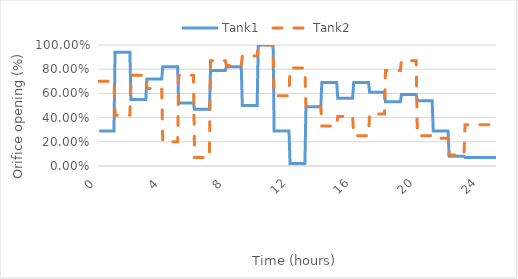
| Category | Tank1  | Tank2  |
|---|---|---|
| 0.0 | 0.29 | 0.7 |
| 0.016666666666666666 | 0.29 | 0.7 |
| 0.03333333333333333 | 0.29 | 0.7 |
| 0.05 | 0.29 | 0.7 |
| 0.06666666666666667 | 0.29 | 0.7 |
| 0.08333333333333333 | 0.29 | 0.7 |
| 0.09999999999999999 | 0.29 | 0.7 |
| 0.11666666666666665 | 0.29 | 0.7 |
| 0.13333333333333333 | 0.29 | 0.7 |
| 0.15 | 0.29 | 0.7 |
| 0.16666666666666666 | 0.29 | 0.7 |
| 0.18333333333333332 | 0.29 | 0.7 |
| 0.19999999999999998 | 0.29 | 0.7 |
| 0.21666666666666665 | 0.29 | 0.7 |
| 0.2333333333333333 | 0.29 | 0.7 |
| 0.24999999999999997 | 0.29 | 0.7 |
| 0.26666666666666666 | 0.29 | 0.7 |
| 0.2833333333333333 | 0.29 | 0.7 |
| 0.3 | 0.29 | 0.7 |
| 0.31666666666666665 | 0.29 | 0.7 |
| 0.3333333333333333 | 0.29 | 0.7 |
| 0.35 | 0.29 | 0.7 |
| 0.36666666666666664 | 0.29 | 0.7 |
| 0.3833333333333333 | 0.29 | 0.7 |
| 0.39999999999999997 | 0.29 | 0.7 |
| 0.41666666666666663 | 0.29 | 0.7 |
| 0.4333333333333333 | 0.29 | 0.7 |
| 0.44999999999999996 | 0.29 | 0.7 |
| 0.4666666666666666 | 0.29 | 0.7 |
| 0.4833333333333333 | 0.29 | 0.7 |
| 0.49999999999999994 | 0.29 | 0.7 |
| 0.5166666666666666 | 0.29 | 0.7 |
| 0.5333333333333333 | 0.29 | 0.7 |
| 0.55 | 0.29 | 0.7 |
| 0.5666666666666668 | 0.29 | 0.7 |
| 0.5833333333333335 | 0.29 | 0.7 |
| 0.6000000000000002 | 0.29 | 0.7 |
| 0.6166666666666669 | 0.29 | 0.7 |
| 0.6333333333333336 | 0.29 | 0.7 |
| 0.6500000000000004 | 0.29 | 0.7 |
| 0.6666666666666671 | 0.29 | 0.7 |
| 0.6833333333333338 | 0.29 | 0.7 |
| 0.7000000000000005 | 0.29 | 0.7 |
| 0.7166666666666672 | 0.29 | 0.7 |
| 0.733333333333334 | 0.29 | 0.7 |
| 0.7500000000000007 | 0.29 | 0.7 |
| 0.7666666666666674 | 0.29 | 0.7 |
| 0.7833333333333341 | 0.29 | 0.7 |
| 0.8000000000000008 | 0.29 | 0.7 |
| 0.8166666666666675 | 0.29 | 0.7 |
| 0.8333333333333343 | 0.29 | 0.7 |
| 0.850000000000001 | 0.29 | 0.7 |
| 0.8666666666666677 | 0.29 | 0.7 |
| 0.8833333333333344 | 0.29 | 0.7 |
| 0.9000000000000011 | 0.29 | 0.7 |
| 0.9166666666666679 | 0.29 | 0.7 |
| 0.9333333333333346 | 0.29 | 0.7 |
| 0.9500000000000013 | 0.29 | 0.7 |
| 0.966666666666668 | 0.29 | 0.7 |
| 0.9833333333333347 | 0.29 | 0.7 |
| 1.0000000000000013 | 0.94 | 0.42 |
| 1.016666666666668 | 0.94 | 0.42 |
| 1.0333333333333345 | 0.94 | 0.42 |
| 1.0500000000000012 | 0.94 | 0.42 |
| 1.0666666666666678 | 0.94 | 0.42 |
| 1.0833333333333344 | 0.94 | 0.42 |
| 1.100000000000001 | 0.94 | 0.42 |
| 1.1166666666666676 | 0.94 | 0.42 |
| 1.1333333333333342 | 0.94 | 0.42 |
| 1.1500000000000008 | 0.94 | 0.42 |
| 1.1666666666666674 | 0.94 | 0.42 |
| 1.183333333333334 | 0.94 | 0.42 |
| 1.2000000000000006 | 0.94 | 0.42 |
| 1.2166666666666672 | 0.94 | 0.42 |
| 1.2333333333333338 | 0.94 | 0.42 |
| 1.2500000000000004 | 0.94 | 0.42 |
| 1.266666666666667 | 0.94 | 0.42 |
| 1.2833333333333337 | 0.94 | 0.42 |
| 1.3000000000000003 | 0.94 | 0.42 |
| 1.3166666666666669 | 0.94 | 0.42 |
| 1.3333333333333335 | 0.94 | 0.42 |
| 1.35 | 0.94 | 0.42 |
| 1.3666666666666667 | 0.94 | 0.42 |
| 1.3833333333333333 | 0.94 | 0.42 |
| 1.4 | 0.94 | 0.42 |
| 1.4166666666666665 | 0.94 | 0.42 |
| 1.4333333333333331 | 0.94 | 0.42 |
| 1.4499999999999997 | 0.94 | 0.42 |
| 1.4666666666666663 | 0.94 | 0.42 |
| 1.483333333333333 | 0.94 | 0.42 |
| 1.4999999999999996 | 0.94 | 0.42 |
| 1.5166666666666662 | 0.94 | 0.42 |
| 1.5333333333333328 | 0.94 | 0.42 |
| 1.5499999999999994 | 0.94 | 0.42 |
| 1.566666666666666 | 0.94 | 0.42 |
| 1.5833333333333326 | 0.94 | 0.42 |
| 1.5999999999999992 | 0.94 | 0.42 |
| 1.6166666666666658 | 0.94 | 0.42 |
| 1.6333333333333324 | 0.94 | 0.42 |
| 1.649999999999999 | 0.94 | 0.42 |
| 1.6666666666666656 | 0.94 | 0.42 |
| 1.6833333333333322 | 0.94 | 0.42 |
| 1.6999999999999988 | 0.94 | 0.42 |
| 1.7166666666666655 | 0.94 | 0.42 |
| 1.733333333333332 | 0.94 | 0.42 |
| 1.7499999999999987 | 0.94 | 0.42 |
| 1.7666666666666653 | 0.94 | 0.42 |
| 1.7833333333333319 | 0.94 | 0.42 |
| 1.7999999999999985 | 0.94 | 0.42 |
| 1.816666666666665 | 0.94 | 0.42 |
| 1.8333333333333317 | 0.94 | 0.42 |
| 1.8499999999999983 | 0.94 | 0.42 |
| 1.866666666666665 | 0.94 | 0.42 |
| 1.8833333333333315 | 0.94 | 0.42 |
| 1.8999999999999981 | 0.94 | 0.42 |
| 1.9166666666666647 | 0.94 | 0.42 |
| 1.9333333333333313 | 0.94 | 0.42 |
| 1.949999999999998 | 0.94 | 0.42 |
| 1.9666666666666646 | 0.94 | 0.42 |
| 1.9833333333333312 | 0.94 | 0.42 |
| 1.9999999999999978 | 0.55 | 0.75 |
| 2.0166666666666644 | 0.55 | 0.75 |
| 2.033333333333331 | 0.55 | 0.75 |
| 2.0499999999999976 | 0.55 | 0.75 |
| 2.066666666666664 | 0.55 | 0.75 |
| 2.083333333333331 | 0.55 | 0.75 |
| 2.0999999999999974 | 0.55 | 0.75 |
| 2.116666666666664 | 0.55 | 0.75 |
| 2.1333333333333306 | 0.55 | 0.75 |
| 2.1499999999999972 | 0.55 | 0.75 |
| 2.166666666666664 | 0.55 | 0.75 |
| 2.1833333333333305 | 0.55 | 0.75 |
| 2.199999999999997 | 0.55 | 0.75 |
| 2.2166666666666637 | 0.55 | 0.75 |
| 2.2333333333333303 | 0.55 | 0.75 |
| 2.249999999999997 | 0.55 | 0.75 |
| 2.2666666666666635 | 0.55 | 0.75 |
| 2.28333333333333 | 0.55 | 0.75 |
| 2.2999999999999967 | 0.55 | 0.75 |
| 2.3166666666666633 | 0.55 | 0.75 |
| 2.33333333333333 | 0.55 | 0.75 |
| 2.3499999999999965 | 0.55 | 0.75 |
| 2.366666666666663 | 0.55 | 0.75 |
| 2.3833333333333298 | 0.55 | 0.75 |
| 2.3999999999999964 | 0.55 | 0.75 |
| 2.416666666666663 | 0.55 | 0.75 |
| 2.4333333333333296 | 0.55 | 0.75 |
| 2.449999999999996 | 0.55 | 0.75 |
| 2.466666666666663 | 0.55 | 0.75 |
| 2.4833333333333294 | 0.55 | 0.75 |
| 2.499999999999996 | 0.55 | 0.75 |
| 2.5166666666666626 | 0.55 | 0.75 |
| 2.533333333333329 | 0.55 | 0.75 |
| 2.549999999999996 | 0.55 | 0.75 |
| 2.5666666666666624 | 0.55 | 0.75 |
| 2.583333333333329 | 0.55 | 0.75 |
| 2.5999999999999956 | 0.55 | 0.75 |
| 2.6166666666666623 | 0.55 | 0.75 |
| 2.633333333333329 | 0.55 | 0.75 |
| 2.6499999999999955 | 0.55 | 0.75 |
| 2.666666666666662 | 0.55 | 0.75 |
| 2.6833333333333287 | 0.55 | 0.75 |
| 2.6999999999999953 | 0.55 | 0.75 |
| 2.716666666666662 | 0.55 | 0.75 |
| 2.7333333333333285 | 0.55 | 0.75 |
| 2.749999999999995 | 0.55 | 0.75 |
| 2.7666666666666617 | 0.55 | 0.75 |
| 2.7833333333333283 | 0.55 | 0.75 |
| 2.799999999999995 | 0.55 | 0.75 |
| 2.8166666666666615 | 0.55 | 0.75 |
| 2.833333333333328 | 0.55 | 0.75 |
| 2.8499999999999948 | 0.55 | 0.75 |
| 2.8666666666666614 | 0.55 | 0.75 |
| 2.883333333333328 | 0.55 | 0.75 |
| 2.8999999999999946 | 0.55 | 0.75 |
| 2.916666666666661 | 0.55 | 0.75 |
| 2.933333333333328 | 0.55 | 0.75 |
| 2.9499999999999944 | 0.55 | 0.75 |
| 2.966666666666661 | 0.55 | 0.75 |
| 2.9833333333333276 | 0.55 | 0.75 |
| 2.9999999999999942 | 0.72 | 0.64 |
| 3.016666666666661 | 0.72 | 0.64 |
| 3.0333333333333274 | 0.72 | 0.64 |
| 3.049999999999994 | 0.72 | 0.64 |
| 3.0666666666666607 | 0.72 | 0.64 |
| 3.0833333333333273 | 0.72 | 0.64 |
| 3.099999999999994 | 0.72 | 0.64 |
| 3.1166666666666605 | 0.72 | 0.64 |
| 3.133333333333327 | 0.72 | 0.64 |
| 3.1499999999999937 | 0.72 | 0.64 |
| 3.1666666666666603 | 0.72 | 0.64 |
| 3.183333333333327 | 0.72 | 0.64 |
| 3.1999999999999935 | 0.72 | 0.64 |
| 3.21666666666666 | 0.72 | 0.64 |
| 3.2333333333333267 | 0.72 | 0.64 |
| 3.2499999999999933 | 0.72 | 0.64 |
| 3.26666666666666 | 0.72 | 0.64 |
| 3.2833333333333266 | 0.72 | 0.64 |
| 3.299999999999993 | 0.72 | 0.64 |
| 3.3166666666666598 | 0.72 | 0.64 |
| 3.3333333333333264 | 0.72 | 0.64 |
| 3.349999999999993 | 0.72 | 0.64 |
| 3.3666666666666596 | 0.72 | 0.64 |
| 3.383333333333326 | 0.72 | 0.64 |
| 3.399999999999993 | 0.72 | 0.64 |
| 3.4166666666666594 | 0.72 | 0.64 |
| 3.433333333333326 | 0.72 | 0.64 |
| 3.4499999999999926 | 0.72 | 0.64 |
| 3.4666666666666592 | 0.72 | 0.64 |
| 3.483333333333326 | 0.72 | 0.64 |
| 3.4999999999999925 | 0.72 | 0.64 |
| 3.516666666666659 | 0.72 | 0.64 |
| 3.5333333333333257 | 0.72 | 0.64 |
| 3.5499999999999923 | 0.72 | 0.64 |
| 3.566666666666659 | 0.72 | 0.64 |
| 3.5833333333333255 | 0.72 | 0.64 |
| 3.599999999999992 | 0.72 | 0.64 |
| 3.6166666666666587 | 0.72 | 0.64 |
| 3.6333333333333253 | 0.72 | 0.64 |
| 3.649999999999992 | 0.72 | 0.64 |
| 3.6666666666666585 | 0.72 | 0.64 |
| 3.683333333333325 | 0.72 | 0.64 |
| 3.6999999999999917 | 0.72 | 0.64 |
| 3.7166666666666583 | 0.72 | 0.64 |
| 3.733333333333325 | 0.72 | 0.64 |
| 3.7499999999999916 | 0.72 | 0.64 |
| 3.766666666666658 | 0.72 | 0.64 |
| 3.7833333333333248 | 0.72 | 0.64 |
| 3.7999999999999914 | 0.72 | 0.64 |
| 3.816666666666658 | 0.72 | 0.64 |
| 3.8333333333333246 | 0.72 | 0.64 |
| 3.849999999999991 | 0.72 | 0.64 |
| 3.866666666666658 | 0.72 | 0.64 |
| 3.8833333333333244 | 0.72 | 0.64 |
| 3.899999999999991 | 0.72 | 0.64 |
| 3.9166666666666576 | 0.72 | 0.64 |
| 3.9333333333333242 | 0.72 | 0.64 |
| 3.949999999999991 | 0.72 | 0.64 |
| 3.9666666666666575 | 0.72 | 0.64 |
| 3.983333333333324 | 0.72 | 0.64 |
| 3.9999999999999907 | 0.82 | 0.2 |
| 4.016666666666658 | 0.82 | 0.2 |
| 4.033333333333324 | 0.82 | 0.2 |
| 4.049999999999991 | 0.82 | 0.2 |
| 4.0666666666666575 | 0.82 | 0.2 |
| 4.083333333333324 | 0.82 | 0.2 |
| 4.099999999999991 | 0.82 | 0.2 |
| 4.116666666666657 | 0.82 | 0.2 |
| 4.133333333333324 | 0.82 | 0.2 |
| 4.149999999999991 | 0.82 | 0.2 |
| 4.166666666666657 | 0.82 | 0.2 |
| 4.183333333333324 | 0.82 | 0.2 |
| 4.19999999999999 | 0.82 | 0.2 |
| 4.216666666666657 | 0.82 | 0.2 |
| 4.233333333333324 | 0.82 | 0.2 |
| 4.24999999999999 | 0.82 | 0.2 |
| 4.266666666666657 | 0.82 | 0.2 |
| 4.2833333333333234 | 0.82 | 0.2 |
| 4.29999999999999 | 0.82 | 0.2 |
| 4.316666666666657 | 0.82 | 0.2 |
| 4.333333333333323 | 0.82 | 0.2 |
| 4.34999999999999 | 0.82 | 0.2 |
| 4.3666666666666565 | 0.82 | 0.2 |
| 4.383333333333323 | 0.82 | 0.2 |
| 4.39999999999999 | 0.82 | 0.2 |
| 4.416666666666656 | 0.82 | 0.2 |
| 4.433333333333323 | 0.82 | 0.2 |
| 4.4499999999999895 | 0.82 | 0.2 |
| 4.466666666666656 | 0.82 | 0.2 |
| 4.483333333333323 | 0.82 | 0.2 |
| 4.499999999999989 | 0.82 | 0.2 |
| 4.516666666666656 | 0.82 | 0.2 |
| 4.533333333333323 | 0.82 | 0.2 |
| 4.549999999999989 | 0.82 | 0.2 |
| 4.566666666666656 | 0.82 | 0.2 |
| 4.583333333333322 | 0.82 | 0.2 |
| 4.599999999999989 | 0.82 | 0.2 |
| 4.616666666666656 | 0.82 | 0.2 |
| 4.633333333333322 | 0.82 | 0.2 |
| 4.649999999999989 | 0.82 | 0.2 |
| 4.666666666666655 | 0.82 | 0.2 |
| 4.683333333333322 | 0.82 | 0.2 |
| 4.699999999999989 | 0.82 | 0.2 |
| 4.716666666666655 | 0.82 | 0.2 |
| 4.733333333333322 | 0.82 | 0.2 |
| 4.7499999999999885 | 0.82 | 0.2 |
| 4.766666666666655 | 0.82 | 0.2 |
| 4.783333333333322 | 0.82 | 0.2 |
| 4.799999999999988 | 0.82 | 0.2 |
| 4.816666666666655 | 0.82 | 0.2 |
| 4.8333333333333215 | 0.82 | 0.2 |
| 4.849999999999988 | 0.82 | 0.2 |
| 4.866666666666655 | 0.82 | 0.2 |
| 4.883333333333321 | 0.82 | 0.2 |
| 4.899999999999988 | 0.82 | 0.2 |
| 4.9166666666666545 | 0.82 | 0.2 |
| 4.933333333333321 | 0.82 | 0.2 |
| 4.949999999999988 | 0.82 | 0.2 |
| 4.966666666666654 | 0.82 | 0.2 |
| 4.983333333333321 | 0.82 | 0.2 |
| 4.999999999999988 | 0.52 | 0.75 |
| 5.016666666666654 | 0.52 | 0.75 |
| 5.033333333333321 | 0.52 | 0.75 |
| 5.049999999999987 | 0.52 | 0.75 |
| 5.066666666666654 | 0.52 | 0.75 |
| 5.083333333333321 | 0.52 | 0.75 |
| 5.099999999999987 | 0.52 | 0.75 |
| 5.116666666666654 | 0.52 | 0.75 |
| 5.13333333333332 | 0.52 | 0.75 |
| 5.149999999999987 | 0.52 | 0.75 |
| 5.166666666666654 | 0.52 | 0.75 |
| 5.18333333333332 | 0.52 | 0.75 |
| 5.199999999999987 | 0.52 | 0.75 |
| 5.2166666666666535 | 0.52 | 0.75 |
| 5.23333333333332 | 0.52 | 0.75 |
| 5.249999999999987 | 0.52 | 0.75 |
| 5.266666666666653 | 0.52 | 0.75 |
| 5.28333333333332 | 0.52 | 0.75 |
| 5.2999999999999865 | 0.52 | 0.75 |
| 5.316666666666653 | 0.52 | 0.75 |
| 5.33333333333332 | 0.52 | 0.75 |
| 5.349999999999986 | 0.52 | 0.75 |
| 5.366666666666653 | 0.52 | 0.75 |
| 5.3833333333333195 | 0.52 | 0.75 |
| 5.399999999999986 | 0.52 | 0.75 |
| 5.416666666666653 | 0.52 | 0.75 |
| 5.433333333333319 | 0.52 | 0.75 |
| 5.449999999999986 | 0.52 | 0.75 |
| 5.466666666666653 | 0.52 | 0.75 |
| 5.483333333333319 | 0.52 | 0.75 |
| 5.499999999999986 | 0.52 | 0.75 |
| 5.516666666666652 | 0.52 | 0.75 |
| 5.533333333333319 | 0.52 | 0.75 |
| 5.549999999999986 | 0.52 | 0.75 |
| 5.566666666666652 | 0.52 | 0.75 |
| 5.583333333333319 | 0.52 | 0.75 |
| 5.599999999999985 | 0.52 | 0.75 |
| 5.616666666666652 | 0.52 | 0.75 |
| 5.633333333333319 | 0.52 | 0.75 |
| 5.649999999999985 | 0.52 | 0.75 |
| 5.666666666666652 | 0.52 | 0.75 |
| 5.6833333333333185 | 0.52 | 0.75 |
| 5.699999999999985 | 0.52 | 0.75 |
| 5.716666666666652 | 0.52 | 0.75 |
| 5.733333333333318 | 0.52 | 0.75 |
| 5.749999999999985 | 0.52 | 0.75 |
| 5.7666666666666515 | 0.52 | 0.75 |
| 5.783333333333318 | 0.52 | 0.75 |
| 5.799999999999985 | 0.52 | 0.75 |
| 5.816666666666651 | 0.52 | 0.75 |
| 5.833333333333318 | 0.52 | 0.75 |
| 5.8499999999999845 | 0.52 | 0.75 |
| 5.866666666666651 | 0.52 | 0.75 |
| 5.883333333333318 | 0.52 | 0.75 |
| 5.899999999999984 | 0.52 | 0.75 |
| 5.916666666666651 | 0.52 | 0.75 |
| 5.933333333333318 | 0.52 | 0.75 |
| 5.949999999999984 | 0.52 | 0.75 |
| 5.966666666666651 | 0.52 | 0.75 |
| 5.983333333333317 | 0.52 | 0.75 |
| 5.999999999999984 | 0.47 | 0.07 |
| 6.016666666666651 | 0.47 | 0.07 |
| 6.033333333333317 | 0.47 | 0.07 |
| 6.049999999999984 | 0.47 | 0.07 |
| 6.06666666666665 | 0.47 | 0.07 |
| 6.083333333333317 | 0.47 | 0.07 |
| 6.099999999999984 | 0.47 | 0.07 |
| 6.11666666666665 | 0.47 | 0.07 |
| 6.133333333333317 | 0.47 | 0.07 |
| 6.1499999999999835 | 0.47 | 0.07 |
| 6.16666666666665 | 0.47 | 0.07 |
| 6.183333333333317 | 0.47 | 0.07 |
| 6.199999999999983 | 0.47 | 0.07 |
| 6.21666666666665 | 0.47 | 0.07 |
| 6.2333333333333165 | 0.47 | 0.07 |
| 6.249999999999983 | 0.47 | 0.07 |
| 6.26666666666665 | 0.47 | 0.07 |
| 6.283333333333316 | 0.47 | 0.07 |
| 6.299999999999983 | 0.47 | 0.07 |
| 6.3166666666666496 | 0.47 | 0.07 |
| 6.333333333333316 | 0.47 | 0.07 |
| 6.349999999999983 | 0.47 | 0.07 |
| 6.366666666666649 | 0.47 | 0.07 |
| 6.383333333333316 | 0.47 | 0.07 |
| 6.399999999999983 | 0.47 | 0.07 |
| 6.416666666666649 | 0.47 | 0.07 |
| 6.433333333333316 | 0.47 | 0.07 |
| 6.449999999999982 | 0.47 | 0.07 |
| 6.466666666666649 | 0.47 | 0.07 |
| 6.483333333333316 | 0.47 | 0.07 |
| 6.499999999999982 | 0.47 | 0.07 |
| 6.516666666666649 | 0.47 | 0.07 |
| 6.5333333333333155 | 0.47 | 0.07 |
| 6.549999999999982 | 0.47 | 0.07 |
| 6.566666666666649 | 0.47 | 0.07 |
| 6.583333333333315 | 0.47 | 0.07 |
| 6.599999999999982 | 0.47 | 0.07 |
| 6.6166666666666485 | 0.47 | 0.07 |
| 6.633333333333315 | 0.47 | 0.07 |
| 6.649999999999982 | 0.47 | 0.07 |
| 6.666666666666648 | 0.47 | 0.07 |
| 6.683333333333315 | 0.47 | 0.07 |
| 6.6999999999999815 | 0.47 | 0.07 |
| 6.716666666666648 | 0.47 | 0.07 |
| 6.733333333333315 | 0.47 | 0.07 |
| 6.749999999999981 | 0.47 | 0.07 |
| 6.766666666666648 | 0.47 | 0.07 |
| 6.783333333333315 | 0.47 | 0.07 |
| 6.799999999999981 | 0.47 | 0.07 |
| 6.816666666666648 | 0.47 | 0.07 |
| 6.833333333333314 | 0.47 | 0.07 |
| 6.849999999999981 | 0.47 | 0.07 |
| 6.866666666666648 | 0.47 | 0.07 |
| 6.883333333333314 | 0.47 | 0.07 |
| 6.899999999999981 | 0.47 | 0.07 |
| 6.916666666666647 | 0.47 | 0.07 |
| 6.933333333333314 | 0.47 | 0.07 |
| 6.949999999999981 | 0.47 | 0.07 |
| 6.966666666666647 | 0.47 | 0.07 |
| 6.983333333333314 | 0.47 | 0.07 |
| 6.9999999999999805 | 0.79 | 0.87 |
| 7.016666666666647 | 0.79 | 0.87 |
| 7.033333333333314 | 0.79 | 0.87 |
| 7.04999999999998 | 0.79 | 0.87 |
| 7.066666666666647 | 0.79 | 0.87 |
| 7.0833333333333135 | 0.79 | 0.87 |
| 7.09999999999998 | 0.79 | 0.87 |
| 7.116666666666647 | 0.79 | 0.87 |
| 7.133333333333313 | 0.79 | 0.87 |
| 7.14999999999998 | 0.79 | 0.87 |
| 7.1666666666666465 | 0.79 | 0.87 |
| 7.183333333333313 | 0.79 | 0.87 |
| 7.19999999999998 | 0.79 | 0.87 |
| 7.216666666666646 | 0.79 | 0.87 |
| 7.233333333333313 | 0.79 | 0.87 |
| 7.24999999999998 | 0.79 | 0.87 |
| 7.266666666666646 | 0.79 | 0.87 |
| 7.283333333333313 | 0.79 | 0.87 |
| 7.299999999999979 | 0.79 | 0.87 |
| 7.316666666666646 | 0.79 | 0.87 |
| 7.333333333333313 | 0.79 | 0.87 |
| 7.349999999999979 | 0.79 | 0.87 |
| 7.366666666666646 | 0.79 | 0.87 |
| 7.383333333333312 | 0.79 | 0.87 |
| 7.399999999999979 | 0.79 | 0.87 |
| 7.416666666666646 | 0.79 | 0.87 |
| 7.433333333333312 | 0.79 | 0.87 |
| 7.449999999999979 | 0.79 | 0.87 |
| 7.4666666666666455 | 0.79 | 0.87 |
| 7.483333333333312 | 0.79 | 0.87 |
| 7.499999999999979 | 0.79 | 0.87 |
| 7.516666666666645 | 0.79 | 0.87 |
| 7.533333333333312 | 0.79 | 0.87 |
| 7.5499999999999785 | 0.79 | 0.87 |
| 7.566666666666645 | 0.79 | 0.87 |
| 7.583333333333312 | 0.79 | 0.87 |
| 7.599999999999978 | 0.79 | 0.87 |
| 7.616666666666645 | 0.79 | 0.87 |
| 7.6333333333333115 | 0.79 | 0.87 |
| 7.649999999999978 | 0.79 | 0.87 |
| 7.666666666666645 | 0.79 | 0.87 |
| 7.683333333333311 | 0.79 | 0.87 |
| 7.699999999999978 | 0.79 | 0.87 |
| 7.716666666666645 | 0.79 | 0.87 |
| 7.733333333333311 | 0.79 | 0.87 |
| 7.749999999999978 | 0.79 | 0.87 |
| 7.766666666666644 | 0.79 | 0.87 |
| 7.783333333333311 | 0.79 | 0.87 |
| 7.799999999999978 | 0.79 | 0.87 |
| 7.816666666666644 | 0.79 | 0.87 |
| 7.833333333333311 | 0.79 | 0.87 |
| 7.849999999999977 | 0.79 | 0.87 |
| 7.866666666666644 | 0.79 | 0.87 |
| 7.883333333333311 | 0.79 | 0.87 |
| 7.899999999999977 | 0.79 | 0.87 |
| 7.916666666666644 | 0.79 | 0.87 |
| 7.9333333333333105 | 0.79 | 0.87 |
| 7.949999999999977 | 0.79 | 0.87 |
| 7.966666666666644 | 0.79 | 0.87 |
| 7.98333333333331 | 0.79 | 0.87 |
| 7.999999999999977 | 0.82 | 0.83 |
| 8.016666666666644 | 0.82 | 0.83 |
| 8.033333333333312 | 0.82 | 0.83 |
| 8.04999999999998 | 0.82 | 0.83 |
| 8.066666666666647 | 0.82 | 0.83 |
| 8.083333333333314 | 0.82 | 0.83 |
| 8.099999999999982 | 0.82 | 0.83 |
| 8.11666666666665 | 0.82 | 0.83 |
| 8.133333333333317 | 0.82 | 0.83 |
| 8.149999999999984 | 0.82 | 0.83 |
| 8.166666666666652 | 0.82 | 0.83 |
| 8.18333333333332 | 0.82 | 0.83 |
| 8.199999999999987 | 0.82 | 0.83 |
| 8.216666666666654 | 0.82 | 0.83 |
| 8.233333333333322 | 0.82 | 0.83 |
| 8.24999999999999 | 0.82 | 0.83 |
| 8.266666666666657 | 0.82 | 0.83 |
| 8.283333333333324 | 0.82 | 0.83 |
| 8.299999999999992 | 0.82 | 0.83 |
| 8.31666666666666 | 0.82 | 0.83 |
| 8.333333333333327 | 0.82 | 0.83 |
| 8.349999999999994 | 0.82 | 0.83 |
| 8.366666666666662 | 0.82 | 0.83 |
| 8.38333333333333 | 0.82 | 0.83 |
| 8.399999999999997 | 0.82 | 0.83 |
| 8.416666666666664 | 0.82 | 0.83 |
| 8.433333333333332 | 0.82 | 0.83 |
| 8.45 | 0.82 | 0.83 |
| 8.466666666666667 | 0.82 | 0.83 |
| 8.483333333333334 | 0.82 | 0.83 |
| 8.500000000000002 | 0.82 | 0.83 |
| 8.51666666666667 | 0.82 | 0.83 |
| 8.533333333333337 | 0.82 | 0.83 |
| 8.550000000000004 | 0.82 | 0.83 |
| 8.566666666666672 | 0.82 | 0.83 |
| 8.58333333333334 | 0.82 | 0.83 |
| 8.600000000000007 | 0.82 | 0.83 |
| 8.616666666666674 | 0.82 | 0.83 |
| 8.633333333333342 | 0.82 | 0.83 |
| 8.65000000000001 | 0.82 | 0.83 |
| 8.666666666666677 | 0.82 | 0.83 |
| 8.683333333333344 | 0.82 | 0.83 |
| 8.700000000000012 | 0.82 | 0.83 |
| 8.71666666666668 | 0.82 | 0.83 |
| 8.733333333333347 | 0.82 | 0.83 |
| 8.750000000000014 | 0.82 | 0.83 |
| 8.766666666666682 | 0.82 | 0.83 |
| 8.78333333333335 | 0.82 | 0.83 |
| 8.800000000000017 | 0.82 | 0.83 |
| 8.816666666666684 | 0.82 | 0.83 |
| 8.833333333333352 | 0.82 | 0.83 |
| 8.85000000000002 | 0.82 | 0.83 |
| 8.866666666666687 | 0.82 | 0.83 |
| 8.883333333333354 | 0.82 | 0.83 |
| 8.900000000000022 | 0.82 | 0.83 |
| 8.91666666666669 | 0.82 | 0.83 |
| 8.933333333333357 | 0.82 | 0.83 |
| 8.950000000000024 | 0.82 | 0.83 |
| 8.966666666666692 | 0.82 | 0.83 |
| 8.98333333333336 | 0.82 | 0.83 |
| 9.000000000000027 | 0.5 | 0.91 |
| 9.016666666666694 | 0.5 | 0.91 |
| 9.033333333333362 | 0.5 | 0.91 |
| 9.05000000000003 | 0.5 | 0.91 |
| 9.066666666666697 | 0.5 | 0.91 |
| 9.083333333333364 | 0.5 | 0.91 |
| 9.100000000000032 | 0.5 | 0.91 |
| 9.1166666666667 | 0.5 | 0.91 |
| 9.133333333333367 | 0.5 | 0.91 |
| 9.150000000000034 | 0.5 | 0.91 |
| 9.166666666666702 | 0.5 | 0.91 |
| 9.183333333333369 | 0.5 | 0.91 |
| 9.200000000000037 | 0.5 | 0.91 |
| 9.216666666666704 | 0.5 | 0.91 |
| 9.233333333333372 | 0.5 | 0.91 |
| 9.250000000000039 | 0.5 | 0.91 |
| 9.266666666666707 | 0.5 | 0.91 |
| 9.283333333333374 | 0.5 | 0.91 |
| 9.300000000000042 | 0.5 | 0.91 |
| 9.316666666666709 | 0.5 | 0.91 |
| 9.333333333333377 | 0.5 | 0.91 |
| 9.350000000000044 | 0.5 | 0.91 |
| 9.366666666666712 | 0.5 | 0.91 |
| 9.383333333333379 | 0.5 | 0.91 |
| 9.400000000000047 | 0.5 | 0.91 |
| 9.416666666666714 | 0.5 | 0.91 |
| 9.433333333333382 | 0.5 | 0.91 |
| 9.450000000000049 | 0.5 | 0.91 |
| 9.466666666666717 | 0.5 | 0.91 |
| 9.483333333333384 | 0.5 | 0.91 |
| 9.500000000000052 | 0.5 | 0.91 |
| 9.516666666666719 | 0.5 | 0.91 |
| 9.533333333333387 | 0.5 | 0.91 |
| 9.550000000000054 | 0.5 | 0.91 |
| 9.566666666666721 | 0.5 | 0.91 |
| 9.583333333333389 | 0.5 | 0.91 |
| 9.600000000000056 | 0.5 | 0.91 |
| 9.616666666666724 | 0.5 | 0.91 |
| 9.633333333333391 | 0.5 | 0.91 |
| 9.650000000000059 | 0.5 | 0.91 |
| 9.666666666666726 | 0.5 | 0.91 |
| 9.683333333333394 | 0.5 | 0.91 |
| 9.700000000000061 | 0.5 | 0.91 |
| 9.716666666666729 | 0.5 | 0.91 |
| 9.733333333333396 | 0.5 | 0.91 |
| 9.750000000000064 | 0.5 | 0.91 |
| 9.766666666666731 | 0.5 | 0.91 |
| 9.783333333333399 | 0.5 | 0.91 |
| 9.800000000000066 | 0.5 | 0.91 |
| 9.816666666666734 | 0.5 | 0.91 |
| 9.833333333333401 | 0.5 | 0.91 |
| 9.850000000000069 | 0.5 | 0.91 |
| 9.866666666666736 | 0.5 | 0.91 |
| 9.883333333333404 | 0.5 | 0.91 |
| 9.900000000000071 | 0.5 | 0.91 |
| 9.916666666666739 | 0.5 | 0.91 |
| 9.933333333333406 | 0.5 | 0.91 |
| 9.950000000000074 | 0.5 | 0.91 |
| 9.966666666666741 | 0.5 | 0.91 |
| 9.983333333333409 | 0.5 | 0.91 |
| 10.000000000000076 | 1 | 1 |
| 10.016666666666744 | 1 | 1 |
| 10.033333333333411 | 1 | 1 |
| 10.050000000000079 | 1 | 1 |
| 10.066666666666746 | 1 | 1 |
| 10.083333333333414 | 1 | 1 |
| 10.100000000000081 | 1 | 1 |
| 10.116666666666749 | 1 | 1 |
| 10.133333333333416 | 1 | 1 |
| 10.150000000000084 | 1 | 1 |
| 10.166666666666751 | 1 | 1 |
| 10.183333333333419 | 1 | 1 |
| 10.200000000000086 | 1 | 1 |
| 10.216666666666754 | 1 | 1 |
| 10.233333333333421 | 1 | 1 |
| 10.250000000000089 | 1 | 1 |
| 10.266666666666756 | 1 | 1 |
| 10.283333333333424 | 1 | 1 |
| 10.300000000000091 | 1 | 1 |
| 10.316666666666759 | 1 | 1 |
| 10.333333333333426 | 1 | 1 |
| 10.350000000000094 | 1 | 1 |
| 10.366666666666761 | 1 | 1 |
| 10.383333333333429 | 1 | 1 |
| 10.400000000000096 | 1 | 1 |
| 10.416666666666764 | 1 | 1 |
| 10.433333333333431 | 1 | 1 |
| 10.450000000000099 | 1 | 1 |
| 10.466666666666766 | 1 | 1 |
| 10.483333333333434 | 1 | 1 |
| 10.500000000000101 | 1 | 1 |
| 10.516666666666769 | 1 | 1 |
| 10.533333333333436 | 1 | 1 |
| 10.550000000000104 | 1 | 1 |
| 10.566666666666771 | 1 | 1 |
| 10.583333333333439 | 1 | 1 |
| 10.600000000000106 | 1 | 1 |
| 10.616666666666774 | 1 | 1 |
| 10.633333333333441 | 1 | 1 |
| 10.650000000000109 | 1 | 1 |
| 10.666666666666776 | 1 | 1 |
| 10.683333333333444 | 1 | 1 |
| 10.700000000000111 | 1 | 1 |
| 10.716666666666779 | 1 | 1 |
| 10.733333333333446 | 1 | 1 |
| 10.750000000000114 | 1 | 1 |
| 10.766666666666781 | 1 | 1 |
| 10.783333333333449 | 1 | 1 |
| 10.800000000000116 | 1 | 1 |
| 10.816666666666784 | 1 | 1 |
| 10.833333333333451 | 1 | 1 |
| 10.850000000000119 | 1 | 1 |
| 10.866666666666786 | 1 | 1 |
| 10.883333333333454 | 1 | 1 |
| 10.900000000000121 | 1 | 1 |
| 10.916666666666789 | 1 | 1 |
| 10.933333333333456 | 1 | 1 |
| 10.950000000000124 | 1 | 1 |
| 10.966666666666791 | 1 | 1 |
| 10.983333333333459 | 1 | 1 |
| 11.000000000000126 | 0.29 | 0.58 |
| 11.016666666666794 | 0.29 | 0.58 |
| 11.033333333333461 | 0.29 | 0.58 |
| 11.050000000000129 | 0.29 | 0.58 |
| 11.066666666666796 | 0.29 | 0.58 |
| 11.083333333333464 | 0.29 | 0.58 |
| 11.100000000000131 | 0.29 | 0.58 |
| 11.116666666666799 | 0.29 | 0.58 |
| 11.133333333333466 | 0.29 | 0.58 |
| 11.150000000000134 | 0.29 | 0.58 |
| 11.166666666666801 | 0.29 | 0.58 |
| 11.183333333333469 | 0.29 | 0.58 |
| 11.200000000000136 | 0.29 | 0.58 |
| 11.216666666666804 | 0.29 | 0.58 |
| 11.233333333333471 | 0.29 | 0.58 |
| 11.250000000000139 | 0.29 | 0.58 |
| 11.266666666666806 | 0.29 | 0.58 |
| 11.283333333333474 | 0.29 | 0.58 |
| 11.300000000000141 | 0.29 | 0.58 |
| 11.316666666666809 | 0.29 | 0.58 |
| 11.333333333333476 | 0.29 | 0.58 |
| 11.350000000000144 | 0.29 | 0.58 |
| 11.366666666666811 | 0.29 | 0.58 |
| 11.383333333333479 | 0.29 | 0.58 |
| 11.400000000000146 | 0.29 | 0.58 |
| 11.416666666666814 | 0.29 | 0.58 |
| 11.433333333333481 | 0.29 | 0.58 |
| 11.450000000000149 | 0.29 | 0.58 |
| 11.466666666666816 | 0.29 | 0.58 |
| 11.483333333333483 | 0.29 | 0.58 |
| 11.500000000000151 | 0.29 | 0.58 |
| 11.516666666666818 | 0.29 | 0.58 |
| 11.533333333333486 | 0.29 | 0.58 |
| 11.550000000000153 | 0.29 | 0.58 |
| 11.566666666666821 | 0.29 | 0.58 |
| 11.583333333333488 | 0.29 | 0.58 |
| 11.600000000000156 | 0.29 | 0.58 |
| 11.616666666666823 | 0.29 | 0.58 |
| 11.633333333333491 | 0.29 | 0.58 |
| 11.650000000000158 | 0.29 | 0.58 |
| 11.666666666666826 | 0.29 | 0.58 |
| 11.683333333333493 | 0.29 | 0.58 |
| 11.700000000000161 | 0.29 | 0.58 |
| 11.716666666666828 | 0.29 | 0.58 |
| 11.733333333333496 | 0.29 | 0.58 |
| 11.750000000000163 | 0.29 | 0.58 |
| 11.766666666666831 | 0.29 | 0.58 |
| 11.783333333333498 | 0.29 | 0.58 |
| 11.800000000000166 | 0.29 | 0.58 |
| 11.816666666666833 | 0.29 | 0.58 |
| 11.833333333333501 | 0.29 | 0.58 |
| 11.850000000000168 | 0.29 | 0.58 |
| 11.866666666666836 | 0.29 | 0.58 |
| 11.883333333333503 | 0.29 | 0.58 |
| 11.90000000000017 | 0.29 | 0.58 |
| 11.916666666666838 | 0.29 | 0.58 |
| 11.933333333333506 | 0.29 | 0.58 |
| 11.950000000000173 | 0.29 | 0.58 |
| 11.96666666666684 | 0.29 | 0.58 |
| 11.983333333333508 | 0.29 | 0.58 |
| 12.000000000000176 | 0.02 | 0.81 |
| 12.016666666666843 | 0.02 | 0.81 |
| 12.03333333333351 | 0.02 | 0.81 |
| 12.050000000000178 | 0.02 | 0.81 |
| 12.066666666666846 | 0.02 | 0.81 |
| 12.083333333333513 | 0.02 | 0.81 |
| 12.10000000000018 | 0.02 | 0.81 |
| 12.116666666666848 | 0.02 | 0.81 |
| 12.133333333333516 | 0.02 | 0.81 |
| 12.150000000000183 | 0.02 | 0.81 |
| 12.16666666666685 | 0.02 | 0.81 |
| 12.183333333333518 | 0.02 | 0.81 |
| 12.200000000000186 | 0.02 | 0.81 |
| 12.216666666666853 | 0.02 | 0.81 |
| 12.23333333333352 | 0.02 | 0.81 |
| 12.250000000000188 | 0.02 | 0.81 |
| 12.266666666666856 | 0.02 | 0.81 |
| 12.283333333333523 | 0.02 | 0.81 |
| 12.30000000000019 | 0.02 | 0.81 |
| 12.316666666666858 | 0.02 | 0.81 |
| 12.333333333333526 | 0.02 | 0.81 |
| 12.350000000000193 | 0.02 | 0.81 |
| 12.36666666666686 | 0.02 | 0.81 |
| 12.383333333333528 | 0.02 | 0.81 |
| 12.400000000000196 | 0.02 | 0.81 |
| 12.416666666666863 | 0.02 | 0.81 |
| 12.43333333333353 | 0.02 | 0.81 |
| 12.450000000000198 | 0.02 | 0.81 |
| 12.466666666666866 | 0.02 | 0.81 |
| 12.483333333333533 | 0.02 | 0.81 |
| 12.5000000000002 | 0.02 | 0.81 |
| 12.516666666666868 | 0.02 | 0.81 |
| 12.533333333333536 | 0.02 | 0.81 |
| 12.550000000000203 | 0.02 | 0.81 |
| 12.56666666666687 | 0.02 | 0.81 |
| 12.583333333333538 | 0.02 | 0.81 |
| 12.600000000000206 | 0.02 | 0.81 |
| 12.616666666666873 | 0.02 | 0.81 |
| 12.63333333333354 | 0.02 | 0.81 |
| 12.650000000000208 | 0.02 | 0.81 |
| 12.666666666666876 | 0.02 | 0.81 |
| 12.683333333333543 | 0.02 | 0.81 |
| 12.70000000000021 | 0.02 | 0.81 |
| 12.716666666666878 | 0.02 | 0.81 |
| 12.733333333333546 | 0.02 | 0.81 |
| 12.750000000000213 | 0.02 | 0.81 |
| 12.76666666666688 | 0.02 | 0.81 |
| 12.783333333333548 | 0.02 | 0.81 |
| 12.800000000000216 | 0.02 | 0.81 |
| 12.816666666666883 | 0.02 | 0.81 |
| 12.83333333333355 | 0.02 | 0.81 |
| 12.850000000000218 | 0.02 | 0.81 |
| 12.866666666666886 | 0.02 | 0.81 |
| 12.883333333333553 | 0.02 | 0.81 |
| 12.90000000000022 | 0.02 | 0.81 |
| 12.916666666666888 | 0.02 | 0.81 |
| 12.933333333333556 | 0.02 | 0.81 |
| 12.950000000000223 | 0.02 | 0.81 |
| 12.96666666666689 | 0.02 | 0.81 |
| 12.983333333333558 | 0.02 | 0.81 |
| 13.000000000000226 | 0.49 | 0.49 |
| 13.016666666666893 | 0.49 | 0.49 |
| 13.03333333333356 | 0.49 | 0.49 |
| 13.050000000000228 | 0.49 | 0.49 |
| 13.066666666666896 | 0.49 | 0.49 |
| 13.083333333333563 | 0.49 | 0.49 |
| 13.10000000000023 | 0.49 | 0.49 |
| 13.116666666666898 | 0.49 | 0.49 |
| 13.133333333333566 | 0.49 | 0.49 |
| 13.150000000000233 | 0.49 | 0.49 |
| 13.1666666666669 | 0.49 | 0.49 |
| 13.183333333333568 | 0.49 | 0.49 |
| 13.200000000000236 | 0.49 | 0.49 |
| 13.216666666666903 | 0.49 | 0.49 |
| 13.23333333333357 | 0.49 | 0.49 |
| 13.250000000000238 | 0.49 | 0.49 |
| 13.266666666666906 | 0.49 | 0.49 |
| 13.283333333333573 | 0.49 | 0.49 |
| 13.30000000000024 | 0.49 | 0.49 |
| 13.316666666666908 | 0.49 | 0.49 |
| 13.333333333333576 | 0.49 | 0.49 |
| 13.350000000000243 | 0.49 | 0.49 |
| 13.36666666666691 | 0.49 | 0.49 |
| 13.383333333333578 | 0.49 | 0.49 |
| 13.400000000000245 | 0.49 | 0.49 |
| 13.416666666666913 | 0.49 | 0.49 |
| 13.43333333333358 | 0.49 | 0.49 |
| 13.450000000000248 | 0.49 | 0.49 |
| 13.466666666666915 | 0.49 | 0.49 |
| 13.483333333333583 | 0.49 | 0.49 |
| 13.50000000000025 | 0.49 | 0.49 |
| 13.516666666666918 | 0.49 | 0.49 |
| 13.533333333333585 | 0.49 | 0.49 |
| 13.550000000000253 | 0.49 | 0.49 |
| 13.56666666666692 | 0.49 | 0.49 |
| 13.583333333333588 | 0.49 | 0.49 |
| 13.600000000000255 | 0.49 | 0.49 |
| 13.616666666666923 | 0.49 | 0.49 |
| 13.63333333333359 | 0.49 | 0.49 |
| 13.650000000000258 | 0.49 | 0.49 |
| 13.666666666666925 | 0.49 | 0.49 |
| 13.683333333333593 | 0.49 | 0.49 |
| 13.70000000000026 | 0.49 | 0.49 |
| 13.716666666666928 | 0.49 | 0.49 |
| 13.733333333333595 | 0.49 | 0.49 |
| 13.750000000000263 | 0.49 | 0.49 |
| 13.76666666666693 | 0.49 | 0.49 |
| 13.783333333333598 | 0.49 | 0.49 |
| 13.800000000000265 | 0.49 | 0.49 |
| 13.816666666666933 | 0.49 | 0.49 |
| 13.8333333333336 | 0.49 | 0.49 |
| 13.850000000000268 | 0.49 | 0.49 |
| 13.866666666666935 | 0.49 | 0.49 |
| 13.883333333333603 | 0.49 | 0.49 |
| 13.90000000000027 | 0.49 | 0.49 |
| 13.916666666666938 | 0.49 | 0.49 |
| 13.933333333333605 | 0.49 | 0.49 |
| 13.950000000000273 | 0.49 | 0.49 |
| 13.96666666666694 | 0.49 | 0.49 |
| 13.983333333333608 | 0.49 | 0.49 |
| 14.000000000000275 | 0.69 | 0.33 |
| 14.016666666666943 | 0.69 | 0.33 |
| 14.03333333333361 | 0.69 | 0.33 |
| 14.050000000000278 | 0.69 | 0.33 |
| 14.066666666666945 | 0.69 | 0.33 |
| 14.083333333333613 | 0.69 | 0.33 |
| 14.10000000000028 | 0.69 | 0.33 |
| 14.116666666666948 | 0.69 | 0.33 |
| 14.133333333333615 | 0.69 | 0.33 |
| 14.150000000000283 | 0.69 | 0.33 |
| 14.16666666666695 | 0.69 | 0.33 |
| 14.183333333333618 | 0.69 | 0.33 |
| 14.200000000000285 | 0.69 | 0.33 |
| 14.216666666666953 | 0.69 | 0.33 |
| 14.23333333333362 | 0.69 | 0.33 |
| 14.250000000000288 | 0.69 | 0.33 |
| 14.266666666666955 | 0.69 | 0.33 |
| 14.283333333333623 | 0.69 | 0.33 |
| 14.30000000000029 | 0.69 | 0.33 |
| 14.316666666666958 | 0.69 | 0.33 |
| 14.333333333333625 | 0.69 | 0.33 |
| 14.350000000000293 | 0.69 | 0.33 |
| 14.36666666666696 | 0.69 | 0.33 |
| 14.383333333333628 | 0.69 | 0.33 |
| 14.400000000000295 | 0.69 | 0.33 |
| 14.416666666666963 | 0.69 | 0.33 |
| 14.43333333333363 | 0.69 | 0.33 |
| 14.450000000000298 | 0.69 | 0.33 |
| 14.466666666666965 | 0.69 | 0.33 |
| 14.483333333333633 | 0.69 | 0.33 |
| 14.5000000000003 | 0.69 | 0.33 |
| 14.516666666666968 | 0.69 | 0.33 |
| 14.533333333333635 | 0.69 | 0.33 |
| 14.550000000000303 | 0.69 | 0.33 |
| 14.56666666666697 | 0.69 | 0.33 |
| 14.583333333333638 | 0.69 | 0.33 |
| 14.600000000000305 | 0.69 | 0.33 |
| 14.616666666666973 | 0.69 | 0.33 |
| 14.63333333333364 | 0.69 | 0.33 |
| 14.650000000000308 | 0.69 | 0.33 |
| 14.666666666666975 | 0.69 | 0.33 |
| 14.683333333333643 | 0.69 | 0.33 |
| 14.70000000000031 | 0.69 | 0.33 |
| 14.716666666666978 | 0.69 | 0.33 |
| 14.733333333333645 | 0.69 | 0.33 |
| 14.750000000000313 | 0.69 | 0.33 |
| 14.76666666666698 | 0.69 | 0.33 |
| 14.783333333333648 | 0.69 | 0.33 |
| 14.800000000000315 | 0.69 | 0.33 |
| 14.816666666666983 | 0.69 | 0.33 |
| 14.83333333333365 | 0.69 | 0.33 |
| 14.850000000000318 | 0.69 | 0.33 |
| 14.866666666666985 | 0.69 | 0.33 |
| 14.883333333333653 | 0.69 | 0.33 |
| 14.90000000000032 | 0.69 | 0.33 |
| 14.916666666666988 | 0.69 | 0.33 |
| 14.933333333333655 | 0.69 | 0.33 |
| 14.950000000000323 | 0.69 | 0.33 |
| 14.96666666666699 | 0.69 | 0.33 |
| 14.983333333333658 | 0.69 | 0.33 |
| 15.000000000000325 | 0.56 | 0.41 |
| 15.016666666666993 | 0.56 | 0.41 |
| 15.03333333333366 | 0.56 | 0.41 |
| 15.050000000000328 | 0.56 | 0.41 |
| 15.066666666666995 | 0.56 | 0.41 |
| 15.083333333333663 | 0.56 | 0.41 |
| 15.10000000000033 | 0.56 | 0.41 |
| 15.116666666666998 | 0.56 | 0.41 |
| 15.133333333333665 | 0.56 | 0.41 |
| 15.150000000000333 | 0.56 | 0.41 |
| 15.166666666667 | 0.56 | 0.41 |
| 15.183333333333668 | 0.56 | 0.41 |
| 15.200000000000335 | 0.56 | 0.41 |
| 15.216666666667003 | 0.56 | 0.41 |
| 15.23333333333367 | 0.56 | 0.41 |
| 15.250000000000338 | 0.56 | 0.41 |
| 15.266666666667005 | 0.56 | 0.41 |
| 15.283333333333672 | 0.56 | 0.41 |
| 15.30000000000034 | 0.56 | 0.41 |
| 15.316666666667007 | 0.56 | 0.41 |
| 15.333333333333675 | 0.56 | 0.41 |
| 15.350000000000342 | 0.56 | 0.41 |
| 15.36666666666701 | 0.56 | 0.41 |
| 15.383333333333677 | 0.56 | 0.41 |
| 15.400000000000345 | 0.56 | 0.41 |
| 15.416666666667012 | 0.56 | 0.41 |
| 15.43333333333368 | 0.56 | 0.41 |
| 15.450000000000347 | 0.56 | 0.41 |
| 15.466666666667015 | 0.56 | 0.41 |
| 15.483333333333682 | 0.56 | 0.41 |
| 15.50000000000035 | 0.56 | 0.41 |
| 15.516666666667017 | 0.56 | 0.41 |
| 15.533333333333685 | 0.56 | 0.41 |
| 15.550000000000352 | 0.56 | 0.41 |
| 15.56666666666702 | 0.56 | 0.41 |
| 15.583333333333687 | 0.56 | 0.41 |
| 15.600000000000355 | 0.56 | 0.41 |
| 15.616666666667022 | 0.56 | 0.41 |
| 15.63333333333369 | 0.56 | 0.41 |
| 15.650000000000357 | 0.56 | 0.41 |
| 15.666666666667025 | 0.56 | 0.41 |
| 15.683333333333692 | 0.56 | 0.41 |
| 15.70000000000036 | 0.56 | 0.41 |
| 15.716666666667027 | 0.56 | 0.41 |
| 15.733333333333695 | 0.56 | 0.41 |
| 15.750000000000362 | 0.56 | 0.41 |
| 15.76666666666703 | 0.56 | 0.41 |
| 15.783333333333697 | 0.56 | 0.41 |
| 15.800000000000365 | 0.56 | 0.41 |
| 15.816666666667032 | 0.56 | 0.41 |
| 15.8333333333337 | 0.56 | 0.41 |
| 15.850000000000367 | 0.56 | 0.41 |
| 15.866666666667035 | 0.56 | 0.41 |
| 15.883333333333702 | 0.56 | 0.41 |
| 15.90000000000037 | 0.56 | 0.41 |
| 15.916666666667037 | 0.56 | 0.41 |
| 15.933333333333705 | 0.56 | 0.41 |
| 15.950000000000372 | 0.56 | 0.41 |
| 15.96666666666704 | 0.56 | 0.41 |
| 15.983333333333707 | 0.56 | 0.41 |
| 16.000000000000373 | 0.69 | 0.25 |
| 16.01666666666704 | 0.69 | 0.25 |
| 16.033333333333704 | 0.69 | 0.25 |
| 16.05000000000037 | 0.69 | 0.25 |
| 16.066666666667036 | 0.69 | 0.25 |
| 16.0833333333337 | 0.69 | 0.25 |
| 16.100000000000367 | 0.69 | 0.25 |
| 16.116666666667033 | 0.69 | 0.25 |
| 16.1333333333337 | 0.69 | 0.25 |
| 16.150000000000365 | 0.69 | 0.25 |
| 16.16666666666703 | 0.69 | 0.25 |
| 16.183333333333696 | 0.69 | 0.25 |
| 16.20000000000036 | 0.69 | 0.25 |
| 16.216666666667027 | 0.69 | 0.25 |
| 16.233333333333693 | 0.69 | 0.25 |
| 16.25000000000036 | 0.69 | 0.25 |
| 16.266666666667025 | 0.69 | 0.25 |
| 16.28333333333369 | 0.69 | 0.25 |
| 16.300000000000356 | 0.69 | 0.25 |
| 16.31666666666702 | 0.69 | 0.25 |
| 16.333333333333687 | 0.69 | 0.25 |
| 16.350000000000353 | 0.69 | 0.25 |
| 16.36666666666702 | 0.69 | 0.25 |
| 16.383333333333685 | 0.69 | 0.25 |
| 16.40000000000035 | 0.69 | 0.25 |
| 16.416666666667016 | 0.69 | 0.25 |
| 16.43333333333368 | 0.69 | 0.25 |
| 16.450000000000347 | 0.69 | 0.25 |
| 16.466666666667013 | 0.69 | 0.25 |
| 16.48333333333368 | 0.69 | 0.25 |
| 16.500000000000345 | 0.69 | 0.25 |
| 16.51666666666701 | 0.69 | 0.25 |
| 16.533333333333676 | 0.69 | 0.25 |
| 16.55000000000034 | 0.69 | 0.25 |
| 16.566666666667007 | 0.69 | 0.25 |
| 16.583333333333673 | 0.69 | 0.25 |
| 16.60000000000034 | 0.69 | 0.25 |
| 16.616666666667005 | 0.69 | 0.25 |
| 16.63333333333367 | 0.69 | 0.25 |
| 16.650000000000336 | 0.69 | 0.25 |
| 16.666666666667002 | 0.69 | 0.25 |
| 16.683333333333668 | 0.69 | 0.25 |
| 16.700000000000333 | 0.69 | 0.25 |
| 16.716666666667 | 0.69 | 0.25 |
| 16.733333333333665 | 0.69 | 0.25 |
| 16.75000000000033 | 0.69 | 0.25 |
| 16.766666666666996 | 0.69 | 0.25 |
| 16.783333333333662 | 0.69 | 0.25 |
| 16.800000000000328 | 0.69 | 0.25 |
| 16.816666666666993 | 0.69 | 0.25 |
| 16.83333333333366 | 0.69 | 0.25 |
| 16.850000000000325 | 0.69 | 0.25 |
| 16.86666666666699 | 0.69 | 0.25 |
| 16.883333333333656 | 0.69 | 0.25 |
| 16.900000000000322 | 0.69 | 0.25 |
| 16.916666666666988 | 0.69 | 0.25 |
| 16.933333333333653 | 0.69 | 0.25 |
| 16.95000000000032 | 0.69 | 0.25 |
| 16.966666666666985 | 0.69 | 0.25 |
| 16.98333333333365 | 0.69 | 0.25 |
| 17.000000000000316 | 0.61 | 0.43 |
| 17.016666666666982 | 0.61 | 0.43 |
| 17.033333333333648 | 0.61 | 0.43 |
| 17.050000000000313 | 0.61 | 0.43 |
| 17.06666666666698 | 0.61 | 0.43 |
| 17.083333333333645 | 0.61 | 0.43 |
| 17.10000000000031 | 0.61 | 0.43 |
| 17.116666666666976 | 0.61 | 0.43 |
| 17.133333333333642 | 0.61 | 0.43 |
| 17.150000000000308 | 0.61 | 0.43 |
| 17.166666666666973 | 0.61 | 0.43 |
| 17.18333333333364 | 0.61 | 0.43 |
| 17.200000000000305 | 0.61 | 0.43 |
| 17.21666666666697 | 0.61 | 0.43 |
| 17.233333333333636 | 0.61 | 0.43 |
| 17.250000000000302 | 0.61 | 0.43 |
| 17.266666666666968 | 0.61 | 0.43 |
| 17.283333333333633 | 0.61 | 0.43 |
| 17.3000000000003 | 0.61 | 0.43 |
| 17.316666666666965 | 0.61 | 0.43 |
| 17.33333333333363 | 0.61 | 0.43 |
| 17.350000000000296 | 0.61 | 0.43 |
| 17.366666666666962 | 0.61 | 0.43 |
| 17.383333333333628 | 0.61 | 0.43 |
| 17.400000000000293 | 0.61 | 0.43 |
| 17.41666666666696 | 0.61 | 0.43 |
| 17.433333333333625 | 0.61 | 0.43 |
| 17.45000000000029 | 0.61 | 0.43 |
| 17.466666666666956 | 0.61 | 0.43 |
| 17.483333333333622 | 0.61 | 0.43 |
| 17.500000000000288 | 0.61 | 0.43 |
| 17.516666666666953 | 0.61 | 0.43 |
| 17.53333333333362 | 0.61 | 0.43 |
| 17.550000000000285 | 0.61 | 0.43 |
| 17.56666666666695 | 0.61 | 0.43 |
| 17.583333333333616 | 0.61 | 0.43 |
| 17.600000000000282 | 0.61 | 0.43 |
| 17.616666666666948 | 0.61 | 0.43 |
| 17.633333333333614 | 0.61 | 0.43 |
| 17.65000000000028 | 0.61 | 0.43 |
| 17.666666666666945 | 0.61 | 0.43 |
| 17.68333333333361 | 0.61 | 0.43 |
| 17.700000000000276 | 0.61 | 0.43 |
| 17.716666666666942 | 0.61 | 0.43 |
| 17.733333333333608 | 0.61 | 0.43 |
| 17.750000000000274 | 0.61 | 0.43 |
| 17.76666666666694 | 0.61 | 0.43 |
| 17.783333333333605 | 0.61 | 0.43 |
| 17.80000000000027 | 0.61 | 0.43 |
| 17.816666666666936 | 0.61 | 0.43 |
| 17.833333333333602 | 0.61 | 0.43 |
| 17.850000000000268 | 0.61 | 0.43 |
| 17.866666666666934 | 0.61 | 0.43 |
| 17.8833333333336 | 0.61 | 0.43 |
| 17.900000000000265 | 0.61 | 0.43 |
| 17.91666666666693 | 0.61 | 0.43 |
| 17.933333333333596 | 0.61 | 0.43 |
| 17.950000000000262 | 0.61 | 0.43 |
| 17.966666666666928 | 0.61 | 0.43 |
| 17.983333333333594 | 0.61 | 0.43 |
| 18.00000000000026 | 0.53 | 0.79 |
| 18.016666666666925 | 0.53 | 0.79 |
| 18.03333333333359 | 0.53 | 0.79 |
| 18.050000000000257 | 0.53 | 0.79 |
| 18.066666666666922 | 0.53 | 0.79 |
| 18.083333333333588 | 0.53 | 0.79 |
| 18.100000000000254 | 0.53 | 0.79 |
| 18.11666666666692 | 0.53 | 0.79 |
| 18.133333333333585 | 0.53 | 0.79 |
| 18.15000000000025 | 0.53 | 0.79 |
| 18.166666666666917 | 0.53 | 0.79 |
| 18.183333333333582 | 0.53 | 0.79 |
| 18.200000000000248 | 0.53 | 0.79 |
| 18.216666666666914 | 0.53 | 0.79 |
| 18.23333333333358 | 0.53 | 0.79 |
| 18.250000000000245 | 0.53 | 0.79 |
| 18.26666666666691 | 0.53 | 0.79 |
| 18.283333333333577 | 0.53 | 0.79 |
| 18.300000000000242 | 0.53 | 0.79 |
| 18.316666666666908 | 0.53 | 0.79 |
| 18.333333333333574 | 0.53 | 0.79 |
| 18.35000000000024 | 0.53 | 0.79 |
| 18.366666666666905 | 0.53 | 0.79 |
| 18.38333333333357 | 0.53 | 0.79 |
| 18.400000000000237 | 0.53 | 0.79 |
| 18.416666666666902 | 0.53 | 0.79 |
| 18.433333333333568 | 0.53 | 0.79 |
| 18.450000000000234 | 0.53 | 0.79 |
| 18.4666666666669 | 0.53 | 0.79 |
| 18.483333333333565 | 0.53 | 0.79 |
| 18.50000000000023 | 0.53 | 0.79 |
| 18.516666666666897 | 0.53 | 0.79 |
| 18.533333333333562 | 0.53 | 0.79 |
| 18.550000000000228 | 0.53 | 0.79 |
| 18.566666666666894 | 0.53 | 0.79 |
| 18.58333333333356 | 0.53 | 0.79 |
| 18.600000000000225 | 0.53 | 0.79 |
| 18.61666666666689 | 0.53 | 0.79 |
| 18.633333333333557 | 0.53 | 0.79 |
| 18.650000000000222 | 0.53 | 0.79 |
| 18.666666666666888 | 0.53 | 0.79 |
| 18.683333333333554 | 0.53 | 0.79 |
| 18.70000000000022 | 0.53 | 0.79 |
| 18.716666666666885 | 0.53 | 0.79 |
| 18.73333333333355 | 0.53 | 0.79 |
| 18.750000000000217 | 0.53 | 0.79 |
| 18.766666666666882 | 0.53 | 0.79 |
| 18.783333333333548 | 0.53 | 0.79 |
| 18.800000000000214 | 0.53 | 0.79 |
| 18.81666666666688 | 0.53 | 0.79 |
| 18.833333333333545 | 0.53 | 0.79 |
| 18.85000000000021 | 0.53 | 0.79 |
| 18.866666666666877 | 0.53 | 0.79 |
| 18.883333333333542 | 0.53 | 0.79 |
| 18.900000000000208 | 0.53 | 0.79 |
| 18.916666666666874 | 0.53 | 0.79 |
| 18.93333333333354 | 0.53 | 0.79 |
| 18.950000000000205 | 0.53 | 0.79 |
| 18.96666666666687 | 0.53 | 0.79 |
| 18.983333333333537 | 0.53 | 0.79 |
| 19.000000000000203 | 0.59 | 0.87 |
| 19.01666666666687 | 0.59 | 0.87 |
| 19.033333333333534 | 0.59 | 0.87 |
| 19.0500000000002 | 0.59 | 0.87 |
| 19.066666666666865 | 0.59 | 0.87 |
| 19.08333333333353 | 0.59 | 0.87 |
| 19.100000000000197 | 0.59 | 0.87 |
| 19.116666666666863 | 0.59 | 0.87 |
| 19.13333333333353 | 0.59 | 0.87 |
| 19.150000000000194 | 0.59 | 0.87 |
| 19.16666666666686 | 0.59 | 0.87 |
| 19.183333333333525 | 0.59 | 0.87 |
| 19.20000000000019 | 0.59 | 0.87 |
| 19.216666666666857 | 0.59 | 0.87 |
| 19.233333333333523 | 0.59 | 0.87 |
| 19.25000000000019 | 0.59 | 0.87 |
| 19.266666666666854 | 0.59 | 0.87 |
| 19.28333333333352 | 0.59 | 0.87 |
| 19.300000000000185 | 0.59 | 0.87 |
| 19.31666666666685 | 0.59 | 0.87 |
| 19.333333333333517 | 0.59 | 0.87 |
| 19.350000000000183 | 0.59 | 0.87 |
| 19.36666666666685 | 0.59 | 0.87 |
| 19.383333333333514 | 0.59 | 0.87 |
| 19.40000000000018 | 0.59 | 0.87 |
| 19.416666666666845 | 0.59 | 0.87 |
| 19.43333333333351 | 0.59 | 0.87 |
| 19.450000000000177 | 0.59 | 0.87 |
| 19.466666666666843 | 0.59 | 0.87 |
| 19.48333333333351 | 0.59 | 0.87 |
| 19.500000000000174 | 0.59 | 0.87 |
| 19.51666666666684 | 0.59 | 0.87 |
| 19.533333333333506 | 0.59 | 0.87 |
| 19.55000000000017 | 0.59 | 0.87 |
| 19.566666666666837 | 0.59 | 0.87 |
| 19.583333333333503 | 0.59 | 0.87 |
| 19.60000000000017 | 0.59 | 0.87 |
| 19.616666666666834 | 0.59 | 0.87 |
| 19.6333333333335 | 0.59 | 0.87 |
| 19.650000000000166 | 0.59 | 0.87 |
| 19.66666666666683 | 0.59 | 0.87 |
| 19.683333333333497 | 0.59 | 0.87 |
| 19.700000000000163 | 0.59 | 0.87 |
| 19.71666666666683 | 0.59 | 0.87 |
| 19.733333333333494 | 0.59 | 0.87 |
| 19.75000000000016 | 0.59 | 0.87 |
| 19.766666666666826 | 0.59 | 0.87 |
| 19.78333333333349 | 0.59 | 0.87 |
| 19.800000000000157 | 0.59 | 0.87 |
| 19.816666666666823 | 0.59 | 0.87 |
| 19.83333333333349 | 0.59 | 0.87 |
| 19.850000000000154 | 0.59 | 0.87 |
| 19.86666666666682 | 0.59 | 0.87 |
| 19.883333333333486 | 0.59 | 0.87 |
| 19.90000000000015 | 0.59 | 0.87 |
| 19.916666666666817 | 0.59 | 0.87 |
| 19.933333333333483 | 0.59 | 0.87 |
| 19.95000000000015 | 0.59 | 0.87 |
| 19.966666666666814 | 0.59 | 0.87 |
| 19.98333333333348 | 0.59 | 0.87 |
| 20.000000000000146 | 0.54 | 0.25 |
| 20.01666666666681 | 0.54 | 0.25 |
| 20.033333333333477 | 0.54 | 0.25 |
| 20.050000000000143 | 0.54 | 0.25 |
| 20.06666666666681 | 0.54 | 0.25 |
| 20.083333333333474 | 0.54 | 0.25 |
| 20.10000000000014 | 0.54 | 0.25 |
| 20.116666666666806 | 0.54 | 0.25 |
| 20.13333333333347 | 0.54 | 0.25 |
| 20.150000000000137 | 0.54 | 0.25 |
| 20.166666666666803 | 0.54 | 0.25 |
| 20.18333333333347 | 0.54 | 0.25 |
| 20.200000000000134 | 0.54 | 0.25 |
| 20.2166666666668 | 0.54 | 0.25 |
| 20.233333333333466 | 0.54 | 0.25 |
| 20.25000000000013 | 0.54 | 0.25 |
| 20.266666666666797 | 0.54 | 0.25 |
| 20.283333333333463 | 0.54 | 0.25 |
| 20.30000000000013 | 0.54 | 0.25 |
| 20.316666666666794 | 0.54 | 0.25 |
| 20.33333333333346 | 0.54 | 0.25 |
| 20.350000000000126 | 0.54 | 0.25 |
| 20.36666666666679 | 0.54 | 0.25 |
| 20.383333333333457 | 0.54 | 0.25 |
| 20.400000000000123 | 0.54 | 0.25 |
| 20.41666666666679 | 0.54 | 0.25 |
| 20.433333333333454 | 0.54 | 0.25 |
| 20.45000000000012 | 0.54 | 0.25 |
| 20.466666666666786 | 0.54 | 0.25 |
| 20.48333333333345 | 0.54 | 0.25 |
| 20.500000000000117 | 0.54 | 0.25 |
| 20.516666666666783 | 0.54 | 0.25 |
| 20.53333333333345 | 0.54 | 0.25 |
| 20.550000000000114 | 0.54 | 0.25 |
| 20.56666666666678 | 0.54 | 0.25 |
| 20.583333333333446 | 0.54 | 0.25 |
| 20.60000000000011 | 0.54 | 0.25 |
| 20.616666666666777 | 0.54 | 0.25 |
| 20.633333333333443 | 0.54 | 0.25 |
| 20.65000000000011 | 0.54 | 0.25 |
| 20.666666666666774 | 0.54 | 0.25 |
| 20.68333333333344 | 0.54 | 0.25 |
| 20.700000000000106 | 0.54 | 0.25 |
| 20.71666666666677 | 0.54 | 0.25 |
| 20.733333333333437 | 0.54 | 0.25 |
| 20.750000000000103 | 0.54 | 0.25 |
| 20.76666666666677 | 0.54 | 0.25 |
| 20.783333333333434 | 0.54 | 0.25 |
| 20.8000000000001 | 0.54 | 0.25 |
| 20.816666666666766 | 0.54 | 0.25 |
| 20.83333333333343 | 0.54 | 0.25 |
| 20.850000000000097 | 0.54 | 0.25 |
| 20.866666666666763 | 0.54 | 0.25 |
| 20.88333333333343 | 0.54 | 0.25 |
| 20.900000000000095 | 0.54 | 0.25 |
| 20.91666666666676 | 0.54 | 0.25 |
| 20.933333333333426 | 0.54 | 0.25 |
| 20.95000000000009 | 0.54 | 0.25 |
| 20.966666666666757 | 0.54 | 0.25 |
| 20.983333333333423 | 0.54 | 0.25 |
| 21.00000000000009 | 0.29 | 0.23 |
| 21.016666666666755 | 0.29 | 0.23 |
| 21.03333333333342 | 0.29 | 0.23 |
| 21.050000000000086 | 0.29 | 0.23 |
| 21.06666666666675 | 0.29 | 0.23 |
| 21.083333333333417 | 0.29 | 0.23 |
| 21.100000000000083 | 0.29 | 0.23 |
| 21.11666666666675 | 0.29 | 0.23 |
| 21.133333333333415 | 0.29 | 0.23 |
| 21.15000000000008 | 0.29 | 0.23 |
| 21.166666666666746 | 0.29 | 0.23 |
| 21.18333333333341 | 0.29 | 0.23 |
| 21.200000000000077 | 0.29 | 0.23 |
| 21.216666666666743 | 0.29 | 0.23 |
| 21.23333333333341 | 0.29 | 0.23 |
| 21.250000000000075 | 0.29 | 0.23 |
| 21.26666666666674 | 0.29 | 0.23 |
| 21.283333333333406 | 0.29 | 0.23 |
| 21.30000000000007 | 0.29 | 0.23 |
| 21.316666666666737 | 0.29 | 0.23 |
| 21.333333333333403 | 0.29 | 0.23 |
| 21.35000000000007 | 0.29 | 0.23 |
| 21.366666666666735 | 0.29 | 0.23 |
| 21.3833333333334 | 0.29 | 0.23 |
| 21.400000000000066 | 0.29 | 0.23 |
| 21.416666666666732 | 0.29 | 0.23 |
| 21.433333333333398 | 0.29 | 0.23 |
| 21.450000000000063 | 0.29 | 0.23 |
| 21.46666666666673 | 0.29 | 0.23 |
| 21.483333333333395 | 0.29 | 0.23 |
| 21.50000000000006 | 0.29 | 0.23 |
| 21.516666666666726 | 0.29 | 0.23 |
| 21.533333333333392 | 0.29 | 0.23 |
| 21.550000000000058 | 0.29 | 0.23 |
| 21.566666666666723 | 0.29 | 0.23 |
| 21.58333333333339 | 0.29 | 0.23 |
| 21.600000000000055 | 0.29 | 0.23 |
| 21.61666666666672 | 0.29 | 0.23 |
| 21.633333333333386 | 0.29 | 0.23 |
| 21.650000000000052 | 0.29 | 0.23 |
| 21.666666666666718 | 0.29 | 0.23 |
| 21.683333333333383 | 0.29 | 0.23 |
| 21.70000000000005 | 0.29 | 0.23 |
| 21.716666666666715 | 0.29 | 0.23 |
| 21.73333333333338 | 0.29 | 0.23 |
| 21.750000000000046 | 0.29 | 0.23 |
| 21.766666666666712 | 0.29 | 0.23 |
| 21.783333333333378 | 0.29 | 0.23 |
| 21.800000000000043 | 0.29 | 0.23 |
| 21.81666666666671 | 0.29 | 0.23 |
| 21.833333333333375 | 0.29 | 0.23 |
| 21.85000000000004 | 0.29 | 0.23 |
| 21.866666666666706 | 0.29 | 0.23 |
| 21.883333333333372 | 0.29 | 0.23 |
| 21.900000000000038 | 0.29 | 0.23 |
| 21.916666666666703 | 0.29 | 0.23 |
| 21.93333333333337 | 0.29 | 0.23 |
| 21.950000000000035 | 0.29 | 0.23 |
| 21.9666666666667 | 0.29 | 0.23 |
| 21.983333333333366 | 0.29 | 0.23 |
| 22.000000000000032 | 0.08 | 0.09 |
| 22.016666666666698 | 0.08 | 0.09 |
| 22.033333333333363 | 0.08 | 0.09 |
| 22.05000000000003 | 0.08 | 0.09 |
| 22.066666666666695 | 0.08 | 0.09 |
| 22.08333333333336 | 0.08 | 0.09 |
| 22.100000000000026 | 0.08 | 0.09 |
| 22.116666666666692 | 0.08 | 0.09 |
| 22.133333333333358 | 0.08 | 0.09 |
| 22.150000000000023 | 0.08 | 0.09 |
| 22.16666666666669 | 0.08 | 0.09 |
| 22.183333333333355 | 0.08 | 0.09 |
| 22.20000000000002 | 0.08 | 0.09 |
| 22.216666666666686 | 0.08 | 0.09 |
| 22.233333333333352 | 0.08 | 0.09 |
| 22.250000000000018 | 0.08 | 0.09 |
| 22.266666666666683 | 0.08 | 0.09 |
| 22.28333333333335 | 0.08 | 0.09 |
| 22.300000000000015 | 0.08 | 0.09 |
| 22.31666666666668 | 0.08 | 0.09 |
| 22.333333333333346 | 0.08 | 0.09 |
| 22.350000000000012 | 0.08 | 0.09 |
| 22.366666666666678 | 0.08 | 0.09 |
| 22.383333333333344 | 0.08 | 0.09 |
| 22.40000000000001 | 0.08 | 0.09 |
| 22.416666666666675 | 0.08 | 0.09 |
| 22.43333333333334 | 0.08 | 0.09 |
| 22.450000000000006 | 0.08 | 0.09 |
| 22.466666666666672 | 0.08 | 0.09 |
| 22.483333333333338 | 0.08 | 0.09 |
| 22.500000000000004 | 0.08 | 0.09 |
| 22.51666666666667 | 0.08 | 0.09 |
| 22.533333333333335 | 0.08 | 0.09 |
| 22.55 | 0.08 | 0.09 |
| 22.566666666666666 | 0.08 | 0.09 |
| 22.583333333333332 | 0.08 | 0.09 |
| 22.599999999999998 | 0.08 | 0.09 |
| 22.616666666666664 | 0.08 | 0.09 |
| 22.63333333333333 | 0.08 | 0.09 |
| 22.649999999999995 | 0.08 | 0.09 |
| 22.66666666666666 | 0.08 | 0.09 |
| 22.683333333333326 | 0.08 | 0.09 |
| 22.699999999999992 | 0.08 | 0.09 |
| 22.716666666666658 | 0.08 | 0.09 |
| 22.733333333333324 | 0.08 | 0.09 |
| 22.74999999999999 | 0.08 | 0.09 |
| 22.766666666666655 | 0.08 | 0.09 |
| 22.78333333333332 | 0.08 | 0.09 |
| 22.799999999999986 | 0.08 | 0.09 |
| 22.816666666666652 | 0.08 | 0.09 |
| 22.833333333333318 | 0.08 | 0.09 |
| 22.849999999999984 | 0.08 | 0.09 |
| 22.86666666666665 | 0.08 | 0.09 |
| 22.883333333333315 | 0.08 | 0.09 |
| 22.89999999999998 | 0.08 | 0.09 |
| 22.916666666666647 | 0.08 | 0.09 |
| 22.933333333333312 | 0.08 | 0.09 |
| 22.949999999999978 | 0.08 | 0.09 |
| 22.966666666666644 | 0.08 | 0.09 |
| 22.98333333333331 | 0.08 | 0.09 |
| 22.999999999999975 | 0.07 | 0.34 |
| 23.01666666666664 | 0.07 | 0.34 |
| 23.033333333333307 | 0.07 | 0.34 |
| 23.049999999999972 | 0.07 | 0.34 |
| 23.066666666666638 | 0.07 | 0.34 |
| 23.083333333333304 | 0.07 | 0.34 |
| 23.09999999999997 | 0.07 | 0.34 |
| 23.116666666666635 | 0.07 | 0.34 |
| 23.1333333333333 | 0.07 | 0.34 |
| 23.149999999999967 | 0.07 | 0.34 |
| 23.166666666666632 | 0.07 | 0.34 |
| 23.183333333333298 | 0.07 | 0.34 |
| 23.199999999999964 | 0.07 | 0.34 |
| 23.21666666666663 | 0.07 | 0.34 |
| 23.233333333333295 | 0.07 | 0.34 |
| 23.24999999999996 | 0.07 | 0.34 |
| 23.266666666666627 | 0.07 | 0.34 |
| 23.283333333333292 | 0.07 | 0.34 |
| 23.299999999999958 | 0.07 | 0.34 |
| 23.316666666666624 | 0.07 | 0.34 |
| 23.33333333333329 | 0.07 | 0.34 |
| 23.349999999999955 | 0.07 | 0.34 |
| 23.36666666666662 | 0.07 | 0.34 |
| 23.383333333333287 | 0.07 | 0.34 |
| 23.399999999999952 | 0.07 | 0.34 |
| 23.416666666666618 | 0.07 | 0.34 |
| 23.433333333333284 | 0.07 | 0.34 |
| 23.44999999999995 | 0.07 | 0.34 |
| 23.466666666666615 | 0.07 | 0.34 |
| 23.48333333333328 | 0.07 | 0.34 |
| 23.499999999999947 | 0.07 | 0.34 |
| 23.516666666666612 | 0.07 | 0.34 |
| 23.533333333333278 | 0.07 | 0.34 |
| 23.549999999999944 | 0.07 | 0.34 |
| 23.56666666666661 | 0.07 | 0.34 |
| 23.583333333333275 | 0.07 | 0.34 |
| 23.59999999999994 | 0.07 | 0.34 |
| 23.616666666666607 | 0.07 | 0.34 |
| 23.633333333333272 | 0.07 | 0.34 |
| 23.649999999999938 | 0.07 | 0.34 |
| 23.666666666666604 | 0.07 | 0.34 |
| 23.68333333333327 | 0.07 | 0.34 |
| 23.699999999999935 | 0.07 | 0.34 |
| 23.7166666666666 | 0.07 | 0.34 |
| 23.733333333333267 | 0.07 | 0.34 |
| 23.749999999999932 | 0.07 | 0.34 |
| 23.766666666666598 | 0.07 | 0.34 |
| 23.783333333333264 | 0.07 | 0.34 |
| 23.79999999999993 | 0.07 | 0.34 |
| 23.816666666666595 | 0.07 | 0.34 |
| 23.83333333333326 | 0.07 | 0.34 |
| 23.849999999999927 | 0.07 | 0.34 |
| 23.866666666666593 | 0.07 | 0.34 |
| 23.88333333333326 | 0.07 | 0.34 |
| 23.899999999999924 | 0.07 | 0.34 |
| 23.91666666666659 | 0.07 | 0.34 |
| 23.933333333333255 | 0.07 | 0.34 |
| 23.94999999999992 | 0.07 | 0.34 |
| 23.966666666666587 | 0.07 | 0.34 |
| 23.983333333333253 | 0.07 | 0.34 |
| 23.99999999999992 | 0.07 | 0.34 |
| 24.016666666666584 | 0.07 | 0.34 |
| 24.03333333333325 | 0.07 | 0.34 |
| 24.049999999999915 | 0.07 | 0.34 |
| 24.06666666666658 | 0.07 | 0.34 |
| 24.083333333333247 | 0.07 | 0.34 |
| 24.099999999999913 | 0.07 | 0.34 |
| 24.11666666666658 | 0.07 | 0.34 |
| 24.133333333333244 | 0.07 | 0.34 |
| 24.14999999999991 | 0.07 | 0.34 |
| 24.166666666666575 | 0.07 | 0.34 |
| 24.18333333333324 | 0.07 | 0.34 |
| 24.199999999999907 | 0.07 | 0.34 |
| 24.216666666666573 | 0.07 | 0.34 |
| 24.23333333333324 | 0.07 | 0.34 |
| 24.249999999999904 | 0.07 | 0.34 |
| 24.26666666666657 | 0.07 | 0.34 |
| 24.283333333333236 | 0.07 | 0.34 |
| 24.2999999999999 | 0.07 | 0.34 |
| 24.316666666666567 | 0.07 | 0.34 |
| 24.333333333333233 | 0.07 | 0.34 |
| 24.3499999999999 | 0.07 | 0.34 |
| 24.366666666666564 | 0.07 | 0.34 |
| 24.38333333333323 | 0.07 | 0.34 |
| 24.399999999999896 | 0.07 | 0.34 |
| 24.41666666666656 | 0.07 | 0.34 |
| 24.433333333333227 | 0.07 | 0.34 |
| 24.449999999999893 | 0.07 | 0.34 |
| 24.46666666666656 | 0.07 | 0.34 |
| 24.483333333333224 | 0.07 | 0.34 |
| 24.49999999999989 | 0.07 | 0.34 |
| 24.516666666666556 | 0.07 | 0.34 |
| 24.53333333333322 | 0.07 | 0.34 |
| 24.549999999999887 | 0.07 | 0.34 |
| 24.566666666666553 | 0.07 | 0.34 |
| 24.58333333333322 | 0.07 | 0.34 |
| 24.599999999999884 | 0.07 | 0.34 |
| 24.61666666666655 | 0.07 | 0.34 |
| 24.633333333333216 | 0.07 | 0.34 |
| 24.64999999999988 | 0.07 | 0.34 |
| 24.666666666666547 | 0.07 | 0.34 |
| 24.683333333333213 | 0.07 | 0.34 |
| 24.69999999999988 | 0.07 | 0.34 |
| 24.716666666666544 | 0.07 | 0.34 |
| 24.73333333333321 | 0.07 | 0.34 |
| 24.749999999999876 | 0.07 | 0.34 |
| 24.76666666666654 | 0.07 | 0.34 |
| 24.783333333333207 | 0.07 | 0.34 |
| 24.799999999999873 | 0.07 | 0.34 |
| 24.81666666666654 | 0.07 | 0.34 |
| 24.833333333333204 | 0.07 | 0.34 |
| 24.84999999999987 | 0.07 | 0.34 |
| 24.866666666666536 | 0.07 | 0.34 |
| 24.8833333333332 | 0.07 | 0.34 |
| 24.899999999999867 | 0.07 | 0.34 |
| 24.916666666666533 | 0.07 | 0.34 |
| 24.9333333333332 | 0.07 | 0.34 |
| 24.949999999999864 | 0.07 | 0.34 |
| 24.96666666666653 | 0.07 | 0.34 |
| 24.983333333333196 | 0.07 | 0.34 |
| 24.99999999999986 | 0.07 | 0.34 |